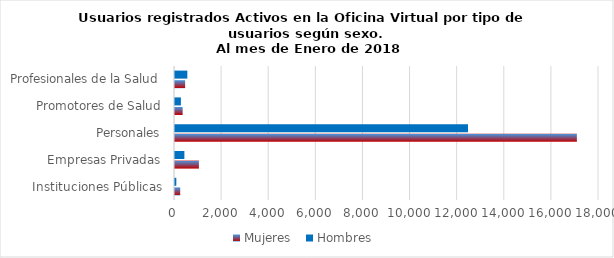
| Category | Mujeres | Hombres |
|---|---|---|
| Instituciones Públicas | 221 | 56 |
| Empresas Privadas | 1015 | 398 |
| Personales | 17061 | 12439 |
| Promotores de Salud | 324 | 250 |
| Profesionales de la Salud | 430 | 524 |